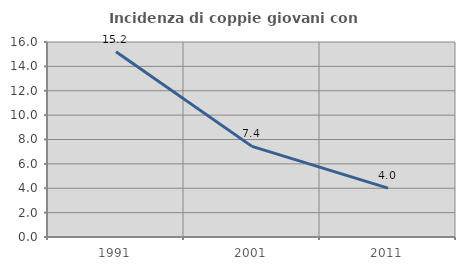
| Category | Incidenza di coppie giovani con figli |
|---|---|
| 1991.0 | 15.207 |
| 2001.0 | 7.437 |
| 2011.0 | 4.012 |